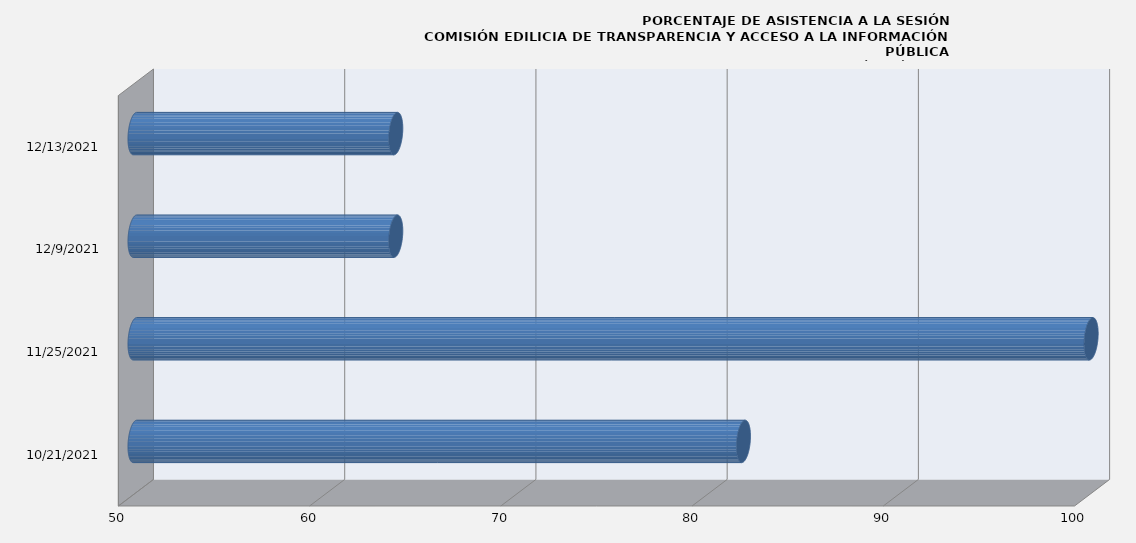
| Category | Series 0 |
|---|---|
| 10/21/21 | 81.818 |
| 11/25/21 | 100 |
| 12/9/21 | 63.636 |
| 12/13/21 | 63.636 |